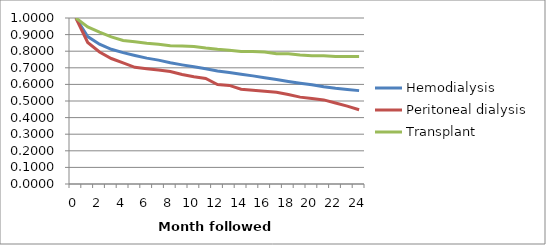
| Category | Hemodialysis | Peritoneal dialysis | Transplant |
|---|---|---|---|
| 0.0 | 1 | 1 | 1 |
| 1.0 | 0.888 | 0.853 | 0.946 |
| 2.0 | 0.842 | 0.795 | 0.915 |
| 3.0 | 0.812 | 0.756 | 0.886 |
| 4.0 | 0.791 | 0.73 | 0.865 |
| 5.0 | 0.774 | 0.703 | 0.857 |
| 6.0 | 0.758 | 0.695 | 0.848 |
| 7.0 | 0.746 | 0.686 | 0.842 |
| 8.0 | 0.731 | 0.678 | 0.833 |
| 9.0 | 0.718 | 0.66 | 0.831 |
| 10.0 | 0.706 | 0.646 | 0.828 |
| 11.0 | 0.694 | 0.636 | 0.819 |
| 12.0 | 0.68 | 0.599 | 0.811 |
| 13.0 | 0.672 | 0.594 | 0.806 |
| 14.0 | 0.662 | 0.571 | 0.798 |
| 15.0 | 0.651 | 0.565 | 0.798 |
| 16.0 | 0.64 | 0.559 | 0.795 |
| 17.0 | 0.629 | 0.552 | 0.785 |
| 18.0 | 0.618 | 0.539 | 0.785 |
| 19.0 | 0.608 | 0.523 | 0.777 |
| 20.0 | 0.598 | 0.516 | 0.773 |
| 21.0 | 0.585 | 0.507 | 0.773 |
| 22.0 | 0.577 | 0.488 | 0.769 |
| 23.0 | 0.569 | 0.469 | 0.769 |
| 24.0 | 0.562 | 0.447 | 0.769 |